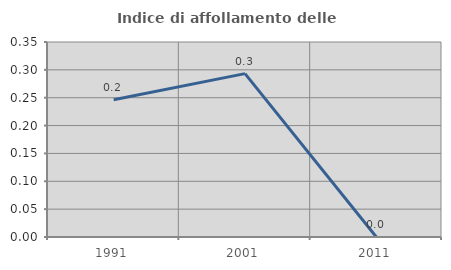
| Category | Indice di affollamento delle abitazioni  |
|---|---|
| 1991.0 | 0.246 |
| 2001.0 | 0.293 |
| 2011.0 | 0 |